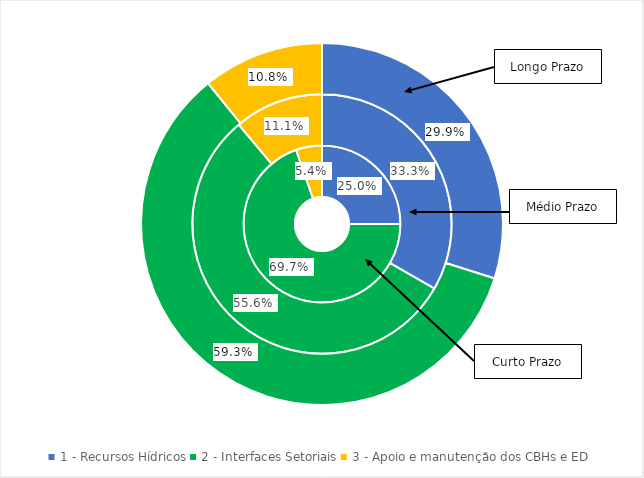
| Category | Curto Prazo (%) | Médio Prazo (%) | Longo Prazo (%) |
|---|---|---|---|
| 1 - Recursos Hídricos | 0.25 | 0.333 | 0.299 |
| 2 - Interfaces Setoriais | 0.697 | 0.556 | 0.593 |
| 3 - Apoio e manutenção dos CBHs e ED | 0.054 | 0.111 | 0.108 |